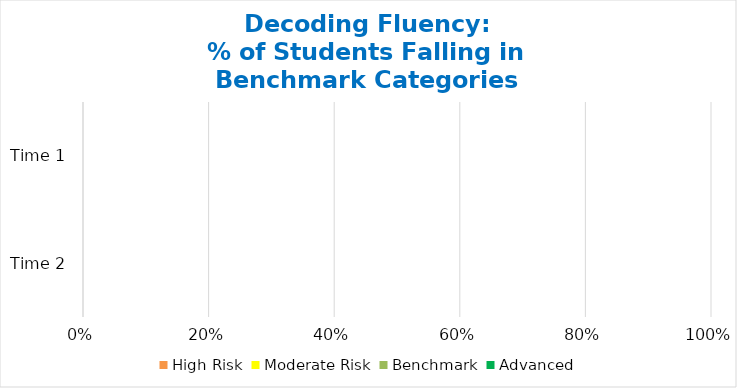
| Category | High Risk | Moderate Risk | Benchmark | Advanced |
|---|---|---|---|---|
| Time 2 | 0 | 0 | 0 | 0 |
| Time 1 | 0 | 0 | 0 | 0 |